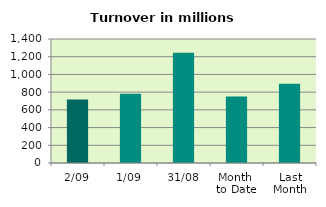
| Category | Series 0 |
|---|---|
| 2/09 | 717.565 |
| 1/09 | 782.385 |
| 31/08 | 1243.837 |
| Month 
to Date | 749.975 |
| Last
Month | 893.956 |